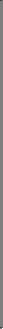
| Category | Greater Bay Area | California | SEER 18 |
|---|---|---|---|
| All races | 0 | 0 |  |
| Asian/Pacific Islander | 0 | 0 |  |
| Hispanic | 0 | 0 |  |
| NH Black | 0 | 0 |  |
| NH White | 0 | 0 |  |